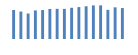
| Category | Exportações (1) |
|---|---|
| 0 | 392293.987 |
| 1 | 370979.678 |
| 2 | 344221.998 |
| 3 | 386156.652 |
| 4 | 390987.572 |
| 5 | 406063.094 |
| 6 | 407598.054 |
| 7 | 406953.169 |
| 8 | 421887.391 |
| 9 | 431264.801 |
| 10 | 442364.452 |
| 11 | 454202.095 |
| 12 | 454929.952 |
| 13 | 393954.142 |
| 14 | 427968.658 |
| 15 | 418325.775 |